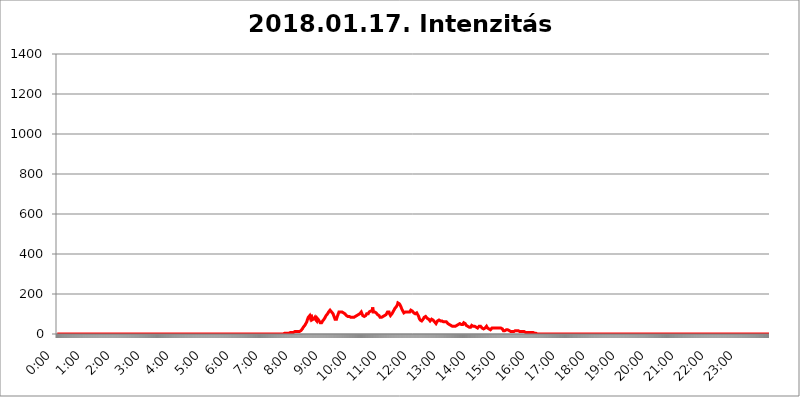
| Category | 2018.01.17. Intenzitás [W/m^2] |
|---|---|
| 0.0 | 0 |
| 0.0006944444444444445 | 0 |
| 0.001388888888888889 | 0 |
| 0.0020833333333333333 | 0 |
| 0.002777777777777778 | 0 |
| 0.003472222222222222 | 0 |
| 0.004166666666666667 | 0 |
| 0.004861111111111111 | 0 |
| 0.005555555555555556 | 0 |
| 0.0062499999999999995 | 0 |
| 0.006944444444444444 | 0 |
| 0.007638888888888889 | 0 |
| 0.008333333333333333 | 0 |
| 0.009027777777777779 | 0 |
| 0.009722222222222222 | 0 |
| 0.010416666666666666 | 0 |
| 0.011111111111111112 | 0 |
| 0.011805555555555555 | 0 |
| 0.012499999999999999 | 0 |
| 0.013194444444444444 | 0 |
| 0.013888888888888888 | 0 |
| 0.014583333333333332 | 0 |
| 0.015277777777777777 | 0 |
| 0.015972222222222224 | 0 |
| 0.016666666666666666 | 0 |
| 0.017361111111111112 | 0 |
| 0.018055555555555557 | 0 |
| 0.01875 | 0 |
| 0.019444444444444445 | 0 |
| 0.02013888888888889 | 0 |
| 0.020833333333333332 | 0 |
| 0.02152777777777778 | 0 |
| 0.022222222222222223 | 0 |
| 0.02291666666666667 | 0 |
| 0.02361111111111111 | 0 |
| 0.024305555555555556 | 0 |
| 0.024999999999999998 | 0 |
| 0.025694444444444447 | 0 |
| 0.02638888888888889 | 0 |
| 0.027083333333333334 | 0 |
| 0.027777777777777776 | 0 |
| 0.02847222222222222 | 0 |
| 0.029166666666666664 | 0 |
| 0.029861111111111113 | 0 |
| 0.030555555555555555 | 0 |
| 0.03125 | 0 |
| 0.03194444444444445 | 0 |
| 0.03263888888888889 | 0 |
| 0.03333333333333333 | 0 |
| 0.034027777777777775 | 0 |
| 0.034722222222222224 | 0 |
| 0.035416666666666666 | 0 |
| 0.036111111111111115 | 0 |
| 0.03680555555555556 | 0 |
| 0.0375 | 0 |
| 0.03819444444444444 | 0 |
| 0.03888888888888889 | 0 |
| 0.03958333333333333 | 0 |
| 0.04027777777777778 | 0 |
| 0.04097222222222222 | 0 |
| 0.041666666666666664 | 0 |
| 0.042361111111111106 | 0 |
| 0.04305555555555556 | 0 |
| 0.043750000000000004 | 0 |
| 0.044444444444444446 | 0 |
| 0.04513888888888889 | 0 |
| 0.04583333333333334 | 0 |
| 0.04652777777777778 | 0 |
| 0.04722222222222222 | 0 |
| 0.04791666666666666 | 0 |
| 0.04861111111111111 | 0 |
| 0.049305555555555554 | 0 |
| 0.049999999999999996 | 0 |
| 0.05069444444444445 | 0 |
| 0.051388888888888894 | 0 |
| 0.052083333333333336 | 0 |
| 0.05277777777777778 | 0 |
| 0.05347222222222222 | 0 |
| 0.05416666666666667 | 0 |
| 0.05486111111111111 | 0 |
| 0.05555555555555555 | 0 |
| 0.05625 | 0 |
| 0.05694444444444444 | 0 |
| 0.057638888888888885 | 0 |
| 0.05833333333333333 | 0 |
| 0.05902777777777778 | 0 |
| 0.059722222222222225 | 0 |
| 0.06041666666666667 | 0 |
| 0.061111111111111116 | 0 |
| 0.06180555555555556 | 0 |
| 0.0625 | 0 |
| 0.06319444444444444 | 0 |
| 0.06388888888888888 | 0 |
| 0.06458333333333334 | 0 |
| 0.06527777777777778 | 0 |
| 0.06597222222222222 | 0 |
| 0.06666666666666667 | 0 |
| 0.06736111111111111 | 0 |
| 0.06805555555555555 | 0 |
| 0.06874999999999999 | 0 |
| 0.06944444444444443 | 0 |
| 0.07013888888888889 | 0 |
| 0.07083333333333333 | 0 |
| 0.07152777777777779 | 0 |
| 0.07222222222222223 | 0 |
| 0.07291666666666667 | 0 |
| 0.07361111111111111 | 0 |
| 0.07430555555555556 | 0 |
| 0.075 | 0 |
| 0.07569444444444444 | 0 |
| 0.0763888888888889 | 0 |
| 0.07708333333333334 | 0 |
| 0.07777777777777778 | 0 |
| 0.07847222222222222 | 0 |
| 0.07916666666666666 | 0 |
| 0.0798611111111111 | 0 |
| 0.08055555555555556 | 0 |
| 0.08125 | 0 |
| 0.08194444444444444 | 0 |
| 0.08263888888888889 | 0 |
| 0.08333333333333333 | 0 |
| 0.08402777777777777 | 0 |
| 0.08472222222222221 | 0 |
| 0.08541666666666665 | 0 |
| 0.08611111111111112 | 0 |
| 0.08680555555555557 | 0 |
| 0.08750000000000001 | 0 |
| 0.08819444444444445 | 0 |
| 0.08888888888888889 | 0 |
| 0.08958333333333333 | 0 |
| 0.09027777777777778 | 0 |
| 0.09097222222222222 | 0 |
| 0.09166666666666667 | 0 |
| 0.09236111111111112 | 0 |
| 0.09305555555555556 | 0 |
| 0.09375 | 0 |
| 0.09444444444444444 | 0 |
| 0.09513888888888888 | 0 |
| 0.09583333333333333 | 0 |
| 0.09652777777777777 | 0 |
| 0.09722222222222222 | 0 |
| 0.09791666666666667 | 0 |
| 0.09861111111111111 | 0 |
| 0.09930555555555555 | 0 |
| 0.09999999999999999 | 0 |
| 0.10069444444444443 | 0 |
| 0.1013888888888889 | 0 |
| 0.10208333333333335 | 0 |
| 0.10277777777777779 | 0 |
| 0.10347222222222223 | 0 |
| 0.10416666666666667 | 0 |
| 0.10486111111111111 | 0 |
| 0.10555555555555556 | 0 |
| 0.10625 | 0 |
| 0.10694444444444444 | 0 |
| 0.1076388888888889 | 0 |
| 0.10833333333333334 | 0 |
| 0.10902777777777778 | 0 |
| 0.10972222222222222 | 0 |
| 0.1111111111111111 | 0 |
| 0.11180555555555556 | 0 |
| 0.11180555555555556 | 0 |
| 0.1125 | 0 |
| 0.11319444444444444 | 0 |
| 0.11388888888888889 | 0 |
| 0.11458333333333333 | 0 |
| 0.11527777777777777 | 0 |
| 0.11597222222222221 | 0 |
| 0.11666666666666665 | 0 |
| 0.1173611111111111 | 0 |
| 0.11805555555555557 | 0 |
| 0.11944444444444445 | 0 |
| 0.12013888888888889 | 0 |
| 0.12083333333333333 | 0 |
| 0.12152777777777778 | 0 |
| 0.12222222222222223 | 0 |
| 0.12291666666666667 | 0 |
| 0.12291666666666667 | 0 |
| 0.12361111111111112 | 0 |
| 0.12430555555555556 | 0 |
| 0.125 | 0 |
| 0.12569444444444444 | 0 |
| 0.12638888888888888 | 0 |
| 0.12708333333333333 | 0 |
| 0.16875 | 0 |
| 0.12847222222222224 | 0 |
| 0.12916666666666668 | 0 |
| 0.12986111111111112 | 0 |
| 0.13055555555555556 | 0 |
| 0.13125 | 0 |
| 0.13194444444444445 | 0 |
| 0.1326388888888889 | 0 |
| 0.13333333333333333 | 0 |
| 0.13402777777777777 | 0 |
| 0.13402777777777777 | 0 |
| 0.13472222222222222 | 0 |
| 0.13541666666666666 | 0 |
| 0.1361111111111111 | 0 |
| 0.13749999999999998 | 0 |
| 0.13819444444444443 | 0 |
| 0.1388888888888889 | 0 |
| 0.13958333333333334 | 0 |
| 0.14027777777777778 | 0 |
| 0.14097222222222222 | 0 |
| 0.14166666666666666 | 0 |
| 0.1423611111111111 | 0 |
| 0.14305555555555557 | 0 |
| 0.14375000000000002 | 0 |
| 0.14444444444444446 | 0 |
| 0.1451388888888889 | 0 |
| 0.1451388888888889 | 0 |
| 0.14652777777777778 | 0 |
| 0.14722222222222223 | 0 |
| 0.14791666666666667 | 0 |
| 0.1486111111111111 | 0 |
| 0.14930555555555555 | 0 |
| 0.15 | 0 |
| 0.15069444444444444 | 0 |
| 0.15138888888888888 | 0 |
| 0.15208333333333332 | 0 |
| 0.15277777777777776 | 0 |
| 0.15347222222222223 | 0 |
| 0.15416666666666667 | 0 |
| 0.15486111111111112 | 0 |
| 0.15555555555555556 | 0 |
| 0.15625 | 0 |
| 0.15694444444444444 | 0 |
| 0.15763888888888888 | 0 |
| 0.15833333333333333 | 0 |
| 0.15902777777777777 | 0 |
| 0.15972222222222224 | 0 |
| 0.16041666666666668 | 0 |
| 0.16111111111111112 | 0 |
| 0.16180555555555556 | 0 |
| 0.1625 | 0 |
| 0.16319444444444445 | 0 |
| 0.1638888888888889 | 0 |
| 0.16458333333333333 | 0 |
| 0.16527777777777777 | 0 |
| 0.16597222222222222 | 0 |
| 0.16666666666666666 | 0 |
| 0.1673611111111111 | 0 |
| 0.16805555555555554 | 0 |
| 0.16874999999999998 | 0 |
| 0.16944444444444443 | 0 |
| 0.17013888888888887 | 0 |
| 0.1708333333333333 | 0 |
| 0.17152777777777775 | 0 |
| 0.17222222222222225 | 0 |
| 0.1729166666666667 | 0 |
| 0.17361111111111113 | 0 |
| 0.17430555555555557 | 0 |
| 0.17500000000000002 | 0 |
| 0.17569444444444446 | 0 |
| 0.1763888888888889 | 0 |
| 0.17708333333333334 | 0 |
| 0.17777777777777778 | 0 |
| 0.17847222222222223 | 0 |
| 0.17916666666666667 | 0 |
| 0.1798611111111111 | 0 |
| 0.18055555555555555 | 0 |
| 0.18125 | 0 |
| 0.18194444444444444 | 0 |
| 0.1826388888888889 | 0 |
| 0.18333333333333335 | 0 |
| 0.1840277777777778 | 0 |
| 0.18472222222222223 | 0 |
| 0.18541666666666667 | 0 |
| 0.18611111111111112 | 0 |
| 0.18680555555555556 | 0 |
| 0.1875 | 0 |
| 0.18819444444444444 | 0 |
| 0.18888888888888888 | 0 |
| 0.18958333333333333 | 0 |
| 0.19027777777777777 | 0 |
| 0.1909722222222222 | 0 |
| 0.19166666666666665 | 0 |
| 0.19236111111111112 | 0 |
| 0.19305555555555554 | 0 |
| 0.19375 | 0 |
| 0.19444444444444445 | 0 |
| 0.1951388888888889 | 0 |
| 0.19583333333333333 | 0 |
| 0.19652777777777777 | 0 |
| 0.19722222222222222 | 0 |
| 0.19791666666666666 | 0 |
| 0.1986111111111111 | 0 |
| 0.19930555555555554 | 0 |
| 0.19999999999999998 | 0 |
| 0.20069444444444443 | 0 |
| 0.20138888888888887 | 0 |
| 0.2020833333333333 | 0 |
| 0.2027777777777778 | 0 |
| 0.2034722222222222 | 0 |
| 0.2041666666666667 | 0 |
| 0.20486111111111113 | 0 |
| 0.20555555555555557 | 0 |
| 0.20625000000000002 | 0 |
| 0.20694444444444446 | 0 |
| 0.2076388888888889 | 0 |
| 0.20833333333333334 | 0 |
| 0.20902777777777778 | 0 |
| 0.20972222222222223 | 0 |
| 0.21041666666666667 | 0 |
| 0.2111111111111111 | 0 |
| 0.21180555555555555 | 0 |
| 0.2125 | 0 |
| 0.21319444444444444 | 0 |
| 0.2138888888888889 | 0 |
| 0.21458333333333335 | 0 |
| 0.2152777777777778 | 0 |
| 0.21597222222222223 | 0 |
| 0.21666666666666667 | 0 |
| 0.21736111111111112 | 0 |
| 0.21805555555555556 | 0 |
| 0.21875 | 0 |
| 0.21944444444444444 | 0 |
| 0.22013888888888888 | 0 |
| 0.22083333333333333 | 0 |
| 0.22152777777777777 | 0 |
| 0.2222222222222222 | 0 |
| 0.22291666666666665 | 0 |
| 0.2236111111111111 | 0 |
| 0.22430555555555556 | 0 |
| 0.225 | 0 |
| 0.22569444444444445 | 0 |
| 0.2263888888888889 | 0 |
| 0.22708333333333333 | 0 |
| 0.22777777777777777 | 0 |
| 0.22847222222222222 | 0 |
| 0.22916666666666666 | 0 |
| 0.2298611111111111 | 0 |
| 0.23055555555555554 | 0 |
| 0.23124999999999998 | 0 |
| 0.23194444444444443 | 0 |
| 0.23263888888888887 | 0 |
| 0.2333333333333333 | 0 |
| 0.2340277777777778 | 0 |
| 0.2347222222222222 | 0 |
| 0.2354166666666667 | 0 |
| 0.23611111111111113 | 0 |
| 0.23680555555555557 | 0 |
| 0.23750000000000002 | 0 |
| 0.23819444444444446 | 0 |
| 0.2388888888888889 | 0 |
| 0.23958333333333334 | 0 |
| 0.24027777777777778 | 0 |
| 0.24097222222222223 | 0 |
| 0.24166666666666667 | 0 |
| 0.2423611111111111 | 0 |
| 0.24305555555555555 | 0 |
| 0.24375 | 0 |
| 0.24444444444444446 | 0 |
| 0.24513888888888888 | 0 |
| 0.24583333333333335 | 0 |
| 0.2465277777777778 | 0 |
| 0.24722222222222223 | 0 |
| 0.24791666666666667 | 0 |
| 0.24861111111111112 | 0 |
| 0.24930555555555556 | 0 |
| 0.25 | 0 |
| 0.25069444444444444 | 0 |
| 0.2513888888888889 | 0 |
| 0.2520833333333333 | 0 |
| 0.25277777777777777 | 0 |
| 0.2534722222222222 | 0 |
| 0.25416666666666665 | 0 |
| 0.2548611111111111 | 0 |
| 0.2555555555555556 | 0 |
| 0.25625000000000003 | 0 |
| 0.2569444444444445 | 0 |
| 0.2576388888888889 | 0 |
| 0.25833333333333336 | 0 |
| 0.2590277777777778 | 0 |
| 0.25972222222222224 | 0 |
| 0.2604166666666667 | 0 |
| 0.2611111111111111 | 0 |
| 0.26180555555555557 | 0 |
| 0.2625 | 0 |
| 0.26319444444444445 | 0 |
| 0.2638888888888889 | 0 |
| 0.26458333333333334 | 0 |
| 0.2652777777777778 | 0 |
| 0.2659722222222222 | 0 |
| 0.26666666666666666 | 0 |
| 0.2673611111111111 | 0 |
| 0.26805555555555555 | 0 |
| 0.26875 | 0 |
| 0.26944444444444443 | 0 |
| 0.2701388888888889 | 0 |
| 0.2708333333333333 | 0 |
| 0.27152777777777776 | 0 |
| 0.2722222222222222 | 0 |
| 0.27291666666666664 | 0 |
| 0.2736111111111111 | 0 |
| 0.2743055555555555 | 0 |
| 0.27499999999999997 | 0 |
| 0.27569444444444446 | 0 |
| 0.27638888888888885 | 0 |
| 0.27708333333333335 | 0 |
| 0.2777777777777778 | 0 |
| 0.27847222222222223 | 0 |
| 0.2791666666666667 | 0 |
| 0.2798611111111111 | 0 |
| 0.28055555555555556 | 0 |
| 0.28125 | 0 |
| 0.28194444444444444 | 0 |
| 0.2826388888888889 | 0 |
| 0.2833333333333333 | 0 |
| 0.28402777777777777 | 0 |
| 0.2847222222222222 | 0 |
| 0.28541666666666665 | 0 |
| 0.28611111111111115 | 0 |
| 0.28680555555555554 | 0 |
| 0.28750000000000003 | 0 |
| 0.2881944444444445 | 0 |
| 0.2888888888888889 | 0 |
| 0.28958333333333336 | 0 |
| 0.2902777777777778 | 0 |
| 0.29097222222222224 | 0 |
| 0.2916666666666667 | 0 |
| 0.2923611111111111 | 0 |
| 0.29305555555555557 | 0 |
| 0.29375 | 0 |
| 0.29444444444444445 | 0 |
| 0.2951388888888889 | 0 |
| 0.29583333333333334 | 0 |
| 0.2965277777777778 | 0 |
| 0.2972222222222222 | 0 |
| 0.29791666666666666 | 0 |
| 0.2986111111111111 | 0 |
| 0.29930555555555555 | 0 |
| 0.3 | 0 |
| 0.30069444444444443 | 0 |
| 0.3013888888888889 | 0 |
| 0.3020833333333333 | 0 |
| 0.30277777777777776 | 0 |
| 0.3034722222222222 | 0 |
| 0.30416666666666664 | 0 |
| 0.3048611111111111 | 0 |
| 0.3055555555555555 | 0 |
| 0.30624999999999997 | 0 |
| 0.3069444444444444 | 0 |
| 0.3076388888888889 | 0 |
| 0.30833333333333335 | 0 |
| 0.3090277777777778 | 0 |
| 0.30972222222222223 | 0 |
| 0.3104166666666667 | 0 |
| 0.3111111111111111 | 0 |
| 0.31180555555555556 | 0 |
| 0.3125 | 0 |
| 0.31319444444444444 | 0 |
| 0.3138888888888889 | 0 |
| 0.3145833333333333 | 0 |
| 0.31527777777777777 | 0 |
| 0.3159722222222222 | 0 |
| 0.31666666666666665 | 0 |
| 0.31736111111111115 | 3.525 |
| 0.31805555555555554 | 3.525 |
| 0.31875000000000003 | 3.525 |
| 0.3194444444444445 | 3.525 |
| 0.3201388888888889 | 3.525 |
| 0.32083333333333336 | 3.525 |
| 0.3215277777777778 | 3.525 |
| 0.32222222222222224 | 3.525 |
| 0.3229166666666667 | 3.525 |
| 0.3236111111111111 | 3.525 |
| 0.32430555555555557 | 3.525 |
| 0.325 | 3.525 |
| 0.32569444444444445 | 3.525 |
| 0.3263888888888889 | 7.887 |
| 0.32708333333333334 | 7.887 |
| 0.3277777777777778 | 7.887 |
| 0.3284722222222222 | 7.887 |
| 0.32916666666666666 | 7.887 |
| 0.3298611111111111 | 7.887 |
| 0.33055555555555555 | 7.887 |
| 0.33125 | 7.887 |
| 0.33194444444444443 | 7.887 |
| 0.3326388888888889 | 7.887 |
| 0.3333333333333333 | 12.257 |
| 0.3340277777777778 | 12.257 |
| 0.3347222222222222 | 12.257 |
| 0.3354166666666667 | 12.257 |
| 0.3361111111111111 | 12.257 |
| 0.3368055555555556 | 12.257 |
| 0.33749999999999997 | 12.257 |
| 0.33819444444444446 | 12.257 |
| 0.33888888888888885 | 12.257 |
| 0.33958333333333335 | 12.257 |
| 0.34027777777777773 | 12.257 |
| 0.34097222222222223 | 12.257 |
| 0.3416666666666666 | 16.636 |
| 0.3423611111111111 | 21.024 |
| 0.3430555555555555 | 21.024 |
| 0.34375 | 25.419 |
| 0.3444444444444445 | 29.823 |
| 0.3451388888888889 | 34.234 |
| 0.3458333333333334 | 38.653 |
| 0.34652777777777777 | 38.653 |
| 0.34722222222222227 | 43.079 |
| 0.34791666666666665 | 47.511 |
| 0.34861111111111115 | 51.951 |
| 0.34930555555555554 | 56.398 |
| 0.35000000000000003 | 60.85 |
| 0.3506944444444444 | 69.775 |
| 0.3513888888888889 | 74.246 |
| 0.3520833333333333 | 83.205 |
| 0.3527777777777778 | 83.205 |
| 0.3534722222222222 | 83.205 |
| 0.3541666666666667 | 92.184 |
| 0.3548611111111111 | 83.205 |
| 0.35555555555555557 | 83.205 |
| 0.35625 | 96.682 |
| 0.35694444444444445 | 69.775 |
| 0.3576388888888889 | 74.246 |
| 0.35833333333333334 | 69.775 |
| 0.3590277777777778 | 74.246 |
| 0.3597222222222222 | 78.722 |
| 0.36041666666666666 | 78.722 |
| 0.3611111111111111 | 83.205 |
| 0.36180555555555555 | 74.246 |
| 0.3625 | 74.246 |
| 0.36319444444444443 | 69.775 |
| 0.3638888888888889 | 65.31 |
| 0.3645833333333333 | 78.722 |
| 0.3652777777777778 | 78.722 |
| 0.3659722222222222 | 78.722 |
| 0.3666666666666667 | 69.775 |
| 0.3673611111111111 | 65.31 |
| 0.3680555555555556 | 65.31 |
| 0.36874999999999997 | 56.398 |
| 0.36944444444444446 | 56.398 |
| 0.37013888888888885 | 56.398 |
| 0.37083333333333335 | 56.398 |
| 0.37152777777777773 | 60.85 |
| 0.37222222222222223 | 65.31 |
| 0.3729166666666666 | 65.31 |
| 0.3736111111111111 | 69.775 |
| 0.3743055555555555 | 74.246 |
| 0.375 | 78.722 |
| 0.3756944444444445 | 83.205 |
| 0.3763888888888889 | 87.692 |
| 0.3770833333333334 | 92.184 |
| 0.37777777777777777 | 92.184 |
| 0.37847222222222227 | 96.682 |
| 0.37916666666666665 | 101.184 |
| 0.37986111111111115 | 105.69 |
| 0.38055555555555554 | 110.201 |
| 0.38125000000000003 | 110.201 |
| 0.3819444444444444 | 114.716 |
| 0.3826388888888889 | 119.235 |
| 0.3833333333333333 | 119.235 |
| 0.3840277777777778 | 114.716 |
| 0.3847222222222222 | 110.201 |
| 0.3854166666666667 | 105.69 |
| 0.3861111111111111 | 110.201 |
| 0.38680555555555557 | 101.184 |
| 0.3875 | 96.682 |
| 0.38819444444444445 | 87.692 |
| 0.3888888888888889 | 87.692 |
| 0.38958333333333334 | 74.246 |
| 0.3902777777777778 | 74.246 |
| 0.3909722222222222 | 74.246 |
| 0.39166666666666666 | 74.246 |
| 0.3923611111111111 | 83.205 |
| 0.39305555555555555 | 87.692 |
| 0.39375 | 96.682 |
| 0.39444444444444443 | 101.184 |
| 0.3951388888888889 | 110.201 |
| 0.3958333333333333 | 110.201 |
| 0.3965277777777778 | 110.201 |
| 0.3972222222222222 | 110.201 |
| 0.3979166666666667 | 110.201 |
| 0.3986111111111111 | 114.716 |
| 0.3993055555555556 | 110.201 |
| 0.39999999999999997 | 110.201 |
| 0.40069444444444446 | 105.69 |
| 0.40138888888888885 | 105.69 |
| 0.40208333333333335 | 101.184 |
| 0.40277777777777773 | 101.184 |
| 0.40347222222222223 | 101.184 |
| 0.4041666666666666 | 96.682 |
| 0.4048611111111111 | 96.682 |
| 0.4055555555555555 | 92.184 |
| 0.40625 | 92.184 |
| 0.4069444444444445 | 87.692 |
| 0.4076388888888889 | 87.692 |
| 0.4083333333333334 | 87.692 |
| 0.40902777777777777 | 87.692 |
| 0.40972222222222227 | 87.692 |
| 0.41041666666666665 | 87.692 |
| 0.41111111111111115 | 87.692 |
| 0.41180555555555554 | 83.205 |
| 0.41250000000000003 | 87.692 |
| 0.4131944444444444 | 83.205 |
| 0.4138888888888889 | 83.205 |
| 0.4145833333333333 | 83.205 |
| 0.4152777777777778 | 83.205 |
| 0.4159722222222222 | 83.205 |
| 0.4166666666666667 | 87.692 |
| 0.4173611111111111 | 87.692 |
| 0.41805555555555557 | 87.692 |
| 0.41875 | 92.184 |
| 0.41944444444444445 | 92.184 |
| 0.4201388888888889 | 92.184 |
| 0.42083333333333334 | 92.184 |
| 0.4215277777777778 | 92.184 |
| 0.4222222222222222 | 96.682 |
| 0.42291666666666666 | 96.682 |
| 0.4236111111111111 | 101.184 |
| 0.42430555555555555 | 101.184 |
| 0.425 | 105.69 |
| 0.42569444444444443 | 105.69 |
| 0.4263888888888889 | 110.201 |
| 0.4270833333333333 | 110.201 |
| 0.4277777777777778 | 110.201 |
| 0.4284722222222222 | 92.184 |
| 0.4291666666666667 | 87.692 |
| 0.4298611111111111 | 87.692 |
| 0.4305555555555556 | 87.692 |
| 0.43124999999999997 | 87.692 |
| 0.43194444444444446 | 92.184 |
| 0.43263888888888885 | 92.184 |
| 0.43333333333333335 | 96.682 |
| 0.43402777777777773 | 101.184 |
| 0.43472222222222223 | 101.184 |
| 0.4354166666666666 | 101.184 |
| 0.4361111111111111 | 101.184 |
| 0.4368055555555555 | 105.69 |
| 0.4375 | 110.201 |
| 0.4381944444444445 | 110.201 |
| 0.4388888888888889 | 114.716 |
| 0.4395833333333334 | 114.716 |
| 0.44027777777777777 | 114.716 |
| 0.44097222222222227 | 114.716 |
| 0.44166666666666665 | 114.716 |
| 0.44236111111111115 | 132.814 |
| 0.44305555555555554 | 110.201 |
| 0.44375000000000003 | 110.201 |
| 0.4444444444444444 | 110.201 |
| 0.4451388888888889 | 110.201 |
| 0.4458333333333333 | 110.201 |
| 0.4465277777777778 | 110.201 |
| 0.4472222222222222 | 105.69 |
| 0.4479166666666667 | 101.184 |
| 0.4486111111111111 | 101.184 |
| 0.44930555555555557 | 96.682 |
| 0.45 | 92.184 |
| 0.45069444444444445 | 92.184 |
| 0.4513888888888889 | 92.184 |
| 0.45208333333333334 | 87.692 |
| 0.4527777777777778 | 83.205 |
| 0.4534722222222222 | 83.205 |
| 0.45416666666666666 | 83.205 |
| 0.4548611111111111 | 83.205 |
| 0.45555555555555555 | 83.205 |
| 0.45625 | 83.205 |
| 0.45694444444444443 | 87.692 |
| 0.4576388888888889 | 92.184 |
| 0.4583333333333333 | 92.184 |
| 0.4590277777777778 | 92.184 |
| 0.4597222222222222 | 92.184 |
| 0.4604166666666667 | 96.682 |
| 0.4611111111111111 | 96.682 |
| 0.4618055555555556 | 101.184 |
| 0.46249999999999997 | 101.184 |
| 0.46319444444444446 | 110.201 |
| 0.46388888888888885 | 110.201 |
| 0.46458333333333335 | 110.201 |
| 0.46527777777777773 | 110.201 |
| 0.46597222222222223 | 101.184 |
| 0.4666666666666666 | 96.682 |
| 0.4673611111111111 | 92.184 |
| 0.4680555555555555 | 96.682 |
| 0.46875 | 96.682 |
| 0.4694444444444445 | 101.184 |
| 0.4701388888888889 | 105.69 |
| 0.4708333333333334 | 110.201 |
| 0.47152777777777777 | 114.716 |
| 0.47222222222222227 | 119.235 |
| 0.47291666666666665 | 123.758 |
| 0.47361111111111115 | 128.284 |
| 0.47430555555555554 | 128.284 |
| 0.47500000000000003 | 132.814 |
| 0.4756944444444444 | 137.347 |
| 0.4763888888888889 | 141.884 |
| 0.4770833333333333 | 146.423 |
| 0.4777777777777778 | 155.509 |
| 0.4784722222222222 | 155.509 |
| 0.4791666666666667 | 155.509 |
| 0.4798611111111111 | 150.964 |
| 0.48055555555555557 | 155.509 |
| 0.48125 | 146.423 |
| 0.48194444444444445 | 137.347 |
| 0.4826388888888889 | 132.814 |
| 0.48333333333333334 | 123.758 |
| 0.4840277777777778 | 119.235 |
| 0.4847222222222222 | 114.716 |
| 0.48541666666666666 | 110.201 |
| 0.4861111111111111 | 105.69 |
| 0.48680555555555555 | 105.69 |
| 0.4875 | 105.69 |
| 0.48819444444444443 | 110.201 |
| 0.4888888888888889 | 110.201 |
| 0.4895833333333333 | 110.201 |
| 0.4902777777777778 | 110.201 |
| 0.4909722222222222 | 110.201 |
| 0.4916666666666667 | 110.201 |
| 0.4923611111111111 | 110.201 |
| 0.4930555555555556 | 105.69 |
| 0.49374999999999997 | 110.201 |
| 0.49444444444444446 | 110.201 |
| 0.49513888888888885 | 114.716 |
| 0.49583333333333335 | 119.235 |
| 0.49652777777777773 | 119.235 |
| 0.49722222222222223 | 114.716 |
| 0.4979166666666666 | 114.716 |
| 0.4986111111111111 | 110.201 |
| 0.4993055555555555 | 110.201 |
| 0.5 | 105.69 |
| 0.5006944444444444 | 101.184 |
| 0.5013888888888889 | 101.184 |
| 0.5020833333333333 | 101.184 |
| 0.5027777777777778 | 105.69 |
| 0.5034722222222222 | 105.69 |
| 0.5041666666666667 | 105.69 |
| 0.5048611111111111 | 101.184 |
| 0.5055555555555555 | 96.682 |
| 0.50625 | 92.184 |
| 0.5069444444444444 | 87.692 |
| 0.5076388888888889 | 78.722 |
| 0.5083333333333333 | 74.246 |
| 0.5090277777777777 | 69.775 |
| 0.5097222222222222 | 65.31 |
| 0.5104166666666666 | 65.31 |
| 0.5111111111111112 | 65.31 |
| 0.5118055555555555 | 65.31 |
| 0.5125000000000001 | 69.775 |
| 0.5131944444444444 | 74.246 |
| 0.513888888888889 | 78.722 |
| 0.5145833333333333 | 83.205 |
| 0.5152777777777778 | 87.692 |
| 0.5159722222222222 | 87.692 |
| 0.5166666666666667 | 87.692 |
| 0.517361111111111 | 87.692 |
| 0.5180555555555556 | 83.205 |
| 0.5187499999999999 | 78.722 |
| 0.5194444444444445 | 74.246 |
| 0.5201388888888888 | 74.246 |
| 0.5208333333333334 | 74.246 |
| 0.5215277777777778 | 69.775 |
| 0.5222222222222223 | 69.775 |
| 0.5229166666666667 | 65.31 |
| 0.5236111111111111 | 69.775 |
| 0.5243055555555556 | 69.775 |
| 0.525 | 74.246 |
| 0.5256944444444445 | 74.246 |
| 0.5263888888888889 | 74.246 |
| 0.5270833333333333 | 69.775 |
| 0.5277777777777778 | 69.775 |
| 0.5284722222222222 | 65.31 |
| 0.5291666666666667 | 60.85 |
| 0.5298611111111111 | 56.398 |
| 0.5305555555555556 | 56.398 |
| 0.53125 | 51.951 |
| 0.5319444444444444 | 56.398 |
| 0.5326388888888889 | 56.398 |
| 0.5333333333333333 | 65.31 |
| 0.5340277777777778 | 65.31 |
| 0.5347222222222222 | 65.31 |
| 0.5354166666666667 | 69.775 |
| 0.5361111111111111 | 69.775 |
| 0.5368055555555555 | 65.31 |
| 0.5375 | 65.31 |
| 0.5381944444444444 | 65.31 |
| 0.5388888888888889 | 65.31 |
| 0.5395833333333333 | 65.31 |
| 0.5402777777777777 | 65.31 |
| 0.5409722222222222 | 60.85 |
| 0.5416666666666666 | 60.85 |
| 0.5423611111111112 | 60.85 |
| 0.5430555555555555 | 56.398 |
| 0.5437500000000001 | 60.85 |
| 0.5444444444444444 | 60.85 |
| 0.545138888888889 | 60.85 |
| 0.5458333333333333 | 60.85 |
| 0.5465277777777778 | 56.398 |
| 0.5472222222222222 | 56.398 |
| 0.5479166666666667 | 51.951 |
| 0.548611111111111 | 51.951 |
| 0.5493055555555556 | 47.511 |
| 0.5499999999999999 | 47.511 |
| 0.5506944444444445 | 43.079 |
| 0.5513888888888888 | 43.079 |
| 0.5520833333333334 | 43.079 |
| 0.5527777777777778 | 43.079 |
| 0.5534722222222223 | 38.653 |
| 0.5541666666666667 | 38.653 |
| 0.5548611111111111 | 38.653 |
| 0.5555555555555556 | 38.653 |
| 0.55625 | 38.653 |
| 0.5569444444444445 | 38.653 |
| 0.5576388888888889 | 38.653 |
| 0.5583333333333333 | 38.653 |
| 0.5590277777777778 | 38.653 |
| 0.5597222222222222 | 43.079 |
| 0.5604166666666667 | 43.079 |
| 0.5611111111111111 | 43.079 |
| 0.5618055555555556 | 43.079 |
| 0.5625 | 47.511 |
| 0.5631944444444444 | 47.511 |
| 0.5638888888888889 | 47.511 |
| 0.5645833333333333 | 51.951 |
| 0.5652777777777778 | 51.951 |
| 0.5659722222222222 | 51.951 |
| 0.5666666666666667 | 47.511 |
| 0.5673611111111111 | 47.511 |
| 0.5680555555555555 | 47.511 |
| 0.56875 | 47.511 |
| 0.5694444444444444 | 51.951 |
| 0.5701388888888889 | 56.398 |
| 0.5708333333333333 | 60.85 |
| 0.5715277777777777 | 56.398 |
| 0.5722222222222222 | 51.951 |
| 0.5729166666666666 | 47.511 |
| 0.5736111111111112 | 43.079 |
| 0.5743055555555555 | 43.079 |
| 0.5750000000000001 | 38.653 |
| 0.5756944444444444 | 38.653 |
| 0.576388888888889 | 38.653 |
| 0.5770833333333333 | 34.234 |
| 0.5777777777777778 | 34.234 |
| 0.5784722222222222 | 34.234 |
| 0.5791666666666667 | 34.234 |
| 0.579861111111111 | 34.234 |
| 0.5805555555555556 | 38.653 |
| 0.5812499999999999 | 43.079 |
| 0.5819444444444445 | 43.079 |
| 0.5826388888888888 | 43.079 |
| 0.5833333333333334 | 38.653 |
| 0.5840277777777778 | 38.653 |
| 0.5847222222222223 | 38.653 |
| 0.5854166666666667 | 38.653 |
| 0.5861111111111111 | 38.653 |
| 0.5868055555555556 | 38.653 |
| 0.5875 | 34.234 |
| 0.5881944444444445 | 34.234 |
| 0.5888888888888889 | 29.823 |
| 0.5895833333333333 | 29.823 |
| 0.5902777777777778 | 29.823 |
| 0.5909722222222222 | 34.234 |
| 0.5916666666666667 | 38.653 |
| 0.5923611111111111 | 38.653 |
| 0.5930555555555556 | 38.653 |
| 0.59375 | 38.653 |
| 0.5944444444444444 | 38.653 |
| 0.5951388888888889 | 34.234 |
| 0.5958333333333333 | 29.823 |
| 0.5965277777777778 | 29.823 |
| 0.5972222222222222 | 25.419 |
| 0.5979166666666667 | 25.419 |
| 0.5986111111111111 | 25.419 |
| 0.5993055555555555 | 29.823 |
| 0.6 | 29.823 |
| 0.6006944444444444 | 34.234 |
| 0.6013888888888889 | 34.234 |
| 0.6020833333333333 | 38.653 |
| 0.6027777777777777 | 34.234 |
| 0.6034722222222222 | 29.823 |
| 0.6041666666666666 | 29.823 |
| 0.6048611111111112 | 29.823 |
| 0.6055555555555555 | 25.419 |
| 0.6062500000000001 | 21.024 |
| 0.6069444444444444 | 21.024 |
| 0.607638888888889 | 21.024 |
| 0.6083333333333333 | 21.024 |
| 0.6090277777777778 | 21.024 |
| 0.6097222222222222 | 29.823 |
| 0.6104166666666667 | 29.823 |
| 0.611111111111111 | 34.234 |
| 0.6118055555555556 | 29.823 |
| 0.6124999999999999 | 29.823 |
| 0.6131944444444445 | 29.823 |
| 0.6138888888888888 | 29.823 |
| 0.6145833333333334 | 29.823 |
| 0.6152777777777778 | 29.823 |
| 0.6159722222222223 | 29.823 |
| 0.6166666666666667 | 25.419 |
| 0.6173611111111111 | 25.419 |
| 0.6180555555555556 | 29.823 |
| 0.61875 | 29.823 |
| 0.6194444444444445 | 29.823 |
| 0.6201388888888889 | 29.823 |
| 0.6208333333333333 | 34.234 |
| 0.6215277777777778 | 34.234 |
| 0.6222222222222222 | 29.823 |
| 0.6229166666666667 | 29.823 |
| 0.6236111111111111 | 25.419 |
| 0.6243055555555556 | 25.419 |
| 0.625 | 21.024 |
| 0.6256944444444444 | 16.636 |
| 0.6263888888888889 | 12.257 |
| 0.6270833333333333 | 16.636 |
| 0.6277777777777778 | 16.636 |
| 0.6284722222222222 | 16.636 |
| 0.6291666666666667 | 21.024 |
| 0.6298611111111111 | 21.024 |
| 0.6305555555555555 | 21.024 |
| 0.63125 | 21.024 |
| 0.6319444444444444 | 21.024 |
| 0.6326388888888889 | 21.024 |
| 0.6333333333333333 | 16.636 |
| 0.6340277777777777 | 16.636 |
| 0.6347222222222222 | 12.257 |
| 0.6354166666666666 | 12.257 |
| 0.6361111111111112 | 12.257 |
| 0.6368055555555555 | 12.257 |
| 0.6375000000000001 | 12.257 |
| 0.6381944444444444 | 12.257 |
| 0.638888888888889 | 12.257 |
| 0.6395833333333333 | 12.257 |
| 0.6402777777777778 | 12.257 |
| 0.6409722222222222 | 12.257 |
| 0.6416666666666667 | 12.257 |
| 0.642361111111111 | 16.636 |
| 0.6430555555555556 | 16.636 |
| 0.6437499999999999 | 16.636 |
| 0.6444444444444445 | 16.636 |
| 0.6451388888888888 | 16.636 |
| 0.6458333333333334 | 16.636 |
| 0.6465277777777778 | 16.636 |
| 0.6472222222222223 | 12.257 |
| 0.6479166666666667 | 12.257 |
| 0.6486111111111111 | 12.257 |
| 0.6493055555555556 | 12.257 |
| 0.65 | 12.257 |
| 0.6506944444444445 | 12.257 |
| 0.6513888888888889 | 12.257 |
| 0.6520833333333333 | 12.257 |
| 0.6527777777777778 | 12.257 |
| 0.6534722222222222 | 12.257 |
| 0.6541666666666667 | 12.257 |
| 0.6548611111111111 | 12.257 |
| 0.6555555555555556 | 12.257 |
| 0.65625 | 12.257 |
| 0.6569444444444444 | 7.887 |
| 0.6576388888888889 | 7.887 |
| 0.6583333333333333 | 7.887 |
| 0.6590277777777778 | 7.887 |
| 0.6597222222222222 | 7.887 |
| 0.6604166666666667 | 7.887 |
| 0.6611111111111111 | 7.887 |
| 0.6618055555555555 | 7.887 |
| 0.6625 | 7.887 |
| 0.6631944444444444 | 7.887 |
| 0.6638888888888889 | 7.887 |
| 0.6645833333333333 | 7.887 |
| 0.6652777777777777 | 7.887 |
| 0.6659722222222222 | 7.887 |
| 0.6666666666666666 | 7.887 |
| 0.6673611111111111 | 7.887 |
| 0.6680555555555556 | 3.525 |
| 0.6687500000000001 | 3.525 |
| 0.6694444444444444 | 3.525 |
| 0.6701388888888888 | 3.525 |
| 0.6708333333333334 | 3.525 |
| 0.6715277777777778 | 3.525 |
| 0.6722222222222222 | 3.525 |
| 0.6729166666666666 | 3.525 |
| 0.6736111111111112 | 0 |
| 0.6743055555555556 | 0 |
| 0.6749999999999999 | 0 |
| 0.6756944444444444 | 0 |
| 0.6763888888888889 | 0 |
| 0.6770833333333334 | 0 |
| 0.6777777777777777 | 0 |
| 0.6784722222222223 | 0 |
| 0.6791666666666667 | 0 |
| 0.6798611111111111 | 0 |
| 0.6805555555555555 | 0 |
| 0.68125 | 0 |
| 0.6819444444444445 | 0 |
| 0.6826388888888889 | 0 |
| 0.6833333333333332 | 0 |
| 0.6840277777777778 | 0 |
| 0.6847222222222222 | 0 |
| 0.6854166666666667 | 0 |
| 0.686111111111111 | 0 |
| 0.6868055555555556 | 0 |
| 0.6875 | 0 |
| 0.6881944444444444 | 0 |
| 0.688888888888889 | 0 |
| 0.6895833333333333 | 0 |
| 0.6902777777777778 | 0 |
| 0.6909722222222222 | 0 |
| 0.6916666666666668 | 0 |
| 0.6923611111111111 | 0 |
| 0.6930555555555555 | 0 |
| 0.69375 | 0 |
| 0.6944444444444445 | 0 |
| 0.6951388888888889 | 0 |
| 0.6958333333333333 | 0 |
| 0.6965277777777777 | 0 |
| 0.6972222222222223 | 0 |
| 0.6979166666666666 | 0 |
| 0.6986111111111111 | 0 |
| 0.6993055555555556 | 0 |
| 0.7000000000000001 | 0 |
| 0.7006944444444444 | 0 |
| 0.7013888888888888 | 0 |
| 0.7020833333333334 | 0 |
| 0.7027777777777778 | 0 |
| 0.7034722222222222 | 0 |
| 0.7041666666666666 | 0 |
| 0.7048611111111112 | 0 |
| 0.7055555555555556 | 0 |
| 0.7062499999999999 | 0 |
| 0.7069444444444444 | 0 |
| 0.7076388888888889 | 0 |
| 0.7083333333333334 | 0 |
| 0.7090277777777777 | 0 |
| 0.7097222222222223 | 0 |
| 0.7104166666666667 | 0 |
| 0.7111111111111111 | 0 |
| 0.7118055555555555 | 0 |
| 0.7125 | 0 |
| 0.7131944444444445 | 0 |
| 0.7138888888888889 | 0 |
| 0.7145833333333332 | 0 |
| 0.7152777777777778 | 0 |
| 0.7159722222222222 | 0 |
| 0.7166666666666667 | 0 |
| 0.717361111111111 | 0 |
| 0.7180555555555556 | 0 |
| 0.71875 | 0 |
| 0.7194444444444444 | 0 |
| 0.720138888888889 | 0 |
| 0.7208333333333333 | 0 |
| 0.7215277777777778 | 0 |
| 0.7222222222222222 | 0 |
| 0.7229166666666668 | 0 |
| 0.7236111111111111 | 0 |
| 0.7243055555555555 | 0 |
| 0.725 | 0 |
| 0.7256944444444445 | 0 |
| 0.7263888888888889 | 0 |
| 0.7270833333333333 | 0 |
| 0.7277777777777777 | 0 |
| 0.7284722222222223 | 0 |
| 0.7291666666666666 | 0 |
| 0.7298611111111111 | 0 |
| 0.7305555555555556 | 0 |
| 0.7312500000000001 | 0 |
| 0.7319444444444444 | 0 |
| 0.7326388888888888 | 0 |
| 0.7333333333333334 | 0 |
| 0.7340277777777778 | 0 |
| 0.7347222222222222 | 0 |
| 0.7354166666666666 | 0 |
| 0.7361111111111112 | 0 |
| 0.7368055555555556 | 0 |
| 0.7374999999999999 | 0 |
| 0.7381944444444444 | 0 |
| 0.7388888888888889 | 0 |
| 0.7395833333333334 | 0 |
| 0.7402777777777777 | 0 |
| 0.7409722222222223 | 0 |
| 0.7416666666666667 | 0 |
| 0.7423611111111111 | 0 |
| 0.7430555555555555 | 0 |
| 0.74375 | 0 |
| 0.7444444444444445 | 0 |
| 0.7451388888888889 | 0 |
| 0.7458333333333332 | 0 |
| 0.7465277777777778 | 0 |
| 0.7472222222222222 | 0 |
| 0.7479166666666667 | 0 |
| 0.748611111111111 | 0 |
| 0.7493055555555556 | 0 |
| 0.75 | 0 |
| 0.7506944444444444 | 0 |
| 0.751388888888889 | 0 |
| 0.7520833333333333 | 0 |
| 0.7527777777777778 | 0 |
| 0.7534722222222222 | 0 |
| 0.7541666666666668 | 0 |
| 0.7548611111111111 | 0 |
| 0.7555555555555555 | 0 |
| 0.75625 | 0 |
| 0.7569444444444445 | 0 |
| 0.7576388888888889 | 0 |
| 0.7583333333333333 | 0 |
| 0.7590277777777777 | 0 |
| 0.7597222222222223 | 0 |
| 0.7604166666666666 | 0 |
| 0.7611111111111111 | 0 |
| 0.7618055555555556 | 0 |
| 0.7625000000000001 | 0 |
| 0.7631944444444444 | 0 |
| 0.7638888888888888 | 0 |
| 0.7645833333333334 | 0 |
| 0.7652777777777778 | 0 |
| 0.7659722222222222 | 0 |
| 0.7666666666666666 | 0 |
| 0.7673611111111112 | 0 |
| 0.7680555555555556 | 0 |
| 0.7687499999999999 | 0 |
| 0.7694444444444444 | 0 |
| 0.7701388888888889 | 0 |
| 0.7708333333333334 | 0 |
| 0.7715277777777777 | 0 |
| 0.7722222222222223 | 0 |
| 0.7729166666666667 | 0 |
| 0.7736111111111111 | 0 |
| 0.7743055555555555 | 0 |
| 0.775 | 0 |
| 0.7756944444444445 | 0 |
| 0.7763888888888889 | 0 |
| 0.7770833333333332 | 0 |
| 0.7777777777777778 | 0 |
| 0.7784722222222222 | 0 |
| 0.7791666666666667 | 0 |
| 0.779861111111111 | 0 |
| 0.7805555555555556 | 0 |
| 0.78125 | 0 |
| 0.7819444444444444 | 0 |
| 0.782638888888889 | 0 |
| 0.7833333333333333 | 0 |
| 0.7840277777777778 | 0 |
| 0.7847222222222222 | 0 |
| 0.7854166666666668 | 0 |
| 0.7861111111111111 | 0 |
| 0.7868055555555555 | 0 |
| 0.7875 | 0 |
| 0.7881944444444445 | 0 |
| 0.7888888888888889 | 0 |
| 0.7895833333333333 | 0 |
| 0.7902777777777777 | 0 |
| 0.7909722222222223 | 0 |
| 0.7916666666666666 | 0 |
| 0.7923611111111111 | 0 |
| 0.7930555555555556 | 0 |
| 0.7937500000000001 | 0 |
| 0.7944444444444444 | 0 |
| 0.7951388888888888 | 0 |
| 0.7958333333333334 | 0 |
| 0.7965277777777778 | 0 |
| 0.7972222222222222 | 0 |
| 0.7979166666666666 | 0 |
| 0.7986111111111112 | 0 |
| 0.7993055555555556 | 0 |
| 0.7999999999999999 | 0 |
| 0.8006944444444444 | 0 |
| 0.8013888888888889 | 0 |
| 0.8020833333333334 | 0 |
| 0.8027777777777777 | 0 |
| 0.8034722222222223 | 0 |
| 0.8041666666666667 | 0 |
| 0.8048611111111111 | 0 |
| 0.8055555555555555 | 0 |
| 0.80625 | 0 |
| 0.8069444444444445 | 0 |
| 0.8076388888888889 | 0 |
| 0.8083333333333332 | 0 |
| 0.8090277777777778 | 0 |
| 0.8097222222222222 | 0 |
| 0.8104166666666667 | 0 |
| 0.811111111111111 | 0 |
| 0.8118055555555556 | 0 |
| 0.8125 | 0 |
| 0.8131944444444444 | 0 |
| 0.813888888888889 | 0 |
| 0.8145833333333333 | 0 |
| 0.8152777777777778 | 0 |
| 0.8159722222222222 | 0 |
| 0.8166666666666668 | 0 |
| 0.8173611111111111 | 0 |
| 0.8180555555555555 | 0 |
| 0.81875 | 0 |
| 0.8194444444444445 | 0 |
| 0.8201388888888889 | 0 |
| 0.8208333333333333 | 0 |
| 0.8215277777777777 | 0 |
| 0.8222222222222223 | 0 |
| 0.8229166666666666 | 0 |
| 0.8236111111111111 | 0 |
| 0.8243055555555556 | 0 |
| 0.8250000000000001 | 0 |
| 0.8256944444444444 | 0 |
| 0.8263888888888888 | 0 |
| 0.8270833333333334 | 0 |
| 0.8277777777777778 | 0 |
| 0.8284722222222222 | 0 |
| 0.8291666666666666 | 0 |
| 0.8298611111111112 | 0 |
| 0.8305555555555556 | 0 |
| 0.8312499999999999 | 0 |
| 0.8319444444444444 | 0 |
| 0.8326388888888889 | 0 |
| 0.8333333333333334 | 0 |
| 0.8340277777777777 | 0 |
| 0.8347222222222223 | 0 |
| 0.8354166666666667 | 0 |
| 0.8361111111111111 | 0 |
| 0.8368055555555555 | 0 |
| 0.8375 | 0 |
| 0.8381944444444445 | 0 |
| 0.8388888888888889 | 0 |
| 0.8395833333333332 | 0 |
| 0.8402777777777778 | 0 |
| 0.8409722222222222 | 0 |
| 0.8416666666666667 | 0 |
| 0.842361111111111 | 0 |
| 0.8430555555555556 | 0 |
| 0.84375 | 0 |
| 0.8444444444444444 | 0 |
| 0.845138888888889 | 0 |
| 0.8458333333333333 | 0 |
| 0.8465277777777778 | 0 |
| 0.8472222222222222 | 0 |
| 0.8479166666666668 | 0 |
| 0.8486111111111111 | 0 |
| 0.8493055555555555 | 0 |
| 0.85 | 0 |
| 0.8506944444444445 | 0 |
| 0.8513888888888889 | 0 |
| 0.8520833333333333 | 0 |
| 0.8527777777777777 | 0 |
| 0.8534722222222223 | 0 |
| 0.8541666666666666 | 0 |
| 0.8548611111111111 | 0 |
| 0.8555555555555556 | 0 |
| 0.8562500000000001 | 0 |
| 0.8569444444444444 | 0 |
| 0.8576388888888888 | 0 |
| 0.8583333333333334 | 0 |
| 0.8590277777777778 | 0 |
| 0.8597222222222222 | 0 |
| 0.8604166666666666 | 0 |
| 0.8611111111111112 | 0 |
| 0.8618055555555556 | 0 |
| 0.8624999999999999 | 0 |
| 0.8631944444444444 | 0 |
| 0.8638888888888889 | 0 |
| 0.8645833333333334 | 0 |
| 0.8652777777777777 | 0 |
| 0.8659722222222223 | 0 |
| 0.8666666666666667 | 0 |
| 0.8673611111111111 | 0 |
| 0.8680555555555555 | 0 |
| 0.86875 | 0 |
| 0.8694444444444445 | 0 |
| 0.8701388888888889 | 0 |
| 0.8708333333333332 | 0 |
| 0.8715277777777778 | 0 |
| 0.8722222222222222 | 0 |
| 0.8729166666666667 | 0 |
| 0.873611111111111 | 0 |
| 0.8743055555555556 | 0 |
| 0.875 | 0 |
| 0.8756944444444444 | 0 |
| 0.876388888888889 | 0 |
| 0.8770833333333333 | 0 |
| 0.8777777777777778 | 0 |
| 0.8784722222222222 | 0 |
| 0.8791666666666668 | 0 |
| 0.8798611111111111 | 0 |
| 0.8805555555555555 | 0 |
| 0.88125 | 0 |
| 0.8819444444444445 | 0 |
| 0.8826388888888889 | 0 |
| 0.8833333333333333 | 0 |
| 0.8840277777777777 | 0 |
| 0.8847222222222223 | 0 |
| 0.8854166666666666 | 0 |
| 0.8861111111111111 | 0 |
| 0.8868055555555556 | 0 |
| 0.8875000000000001 | 0 |
| 0.8881944444444444 | 0 |
| 0.8888888888888888 | 0 |
| 0.8895833333333334 | 0 |
| 0.8902777777777778 | 0 |
| 0.8909722222222222 | 0 |
| 0.8916666666666666 | 0 |
| 0.8923611111111112 | 0 |
| 0.8930555555555556 | 0 |
| 0.8937499999999999 | 0 |
| 0.8944444444444444 | 0 |
| 0.8951388888888889 | 0 |
| 0.8958333333333334 | 0 |
| 0.8965277777777777 | 0 |
| 0.8972222222222223 | 0 |
| 0.8979166666666667 | 0 |
| 0.8986111111111111 | 0 |
| 0.8993055555555555 | 0 |
| 0.9 | 0 |
| 0.9006944444444445 | 0 |
| 0.9013888888888889 | 0 |
| 0.9020833333333332 | 0 |
| 0.9027777777777778 | 0 |
| 0.9034722222222222 | 0 |
| 0.9041666666666667 | 0 |
| 0.904861111111111 | 0 |
| 0.9055555555555556 | 0 |
| 0.90625 | 0 |
| 0.9069444444444444 | 0 |
| 0.907638888888889 | 0 |
| 0.9083333333333333 | 0 |
| 0.9090277777777778 | 0 |
| 0.9097222222222222 | 0 |
| 0.9104166666666668 | 0 |
| 0.9111111111111111 | 0 |
| 0.9118055555555555 | 0 |
| 0.9125 | 0 |
| 0.9131944444444445 | 0 |
| 0.9138888888888889 | 0 |
| 0.9145833333333333 | 0 |
| 0.9152777777777777 | 0 |
| 0.9159722222222223 | 0 |
| 0.9166666666666666 | 0 |
| 0.9173611111111111 | 0 |
| 0.9180555555555556 | 0 |
| 0.9187500000000001 | 0 |
| 0.9194444444444444 | 0 |
| 0.9201388888888888 | 0 |
| 0.9208333333333334 | 0 |
| 0.9215277777777778 | 0 |
| 0.9222222222222222 | 0 |
| 0.9229166666666666 | 0 |
| 0.9236111111111112 | 0 |
| 0.9243055555555556 | 0 |
| 0.9249999999999999 | 0 |
| 0.9256944444444444 | 0 |
| 0.9263888888888889 | 0 |
| 0.9270833333333334 | 0 |
| 0.9277777777777777 | 0 |
| 0.9284722222222223 | 0 |
| 0.9291666666666667 | 0 |
| 0.9298611111111111 | 0 |
| 0.9305555555555555 | 0 |
| 0.93125 | 0 |
| 0.9319444444444445 | 0 |
| 0.9326388888888889 | 0 |
| 0.9333333333333332 | 0 |
| 0.9340277777777778 | 0 |
| 0.9347222222222222 | 0 |
| 0.9354166666666667 | 0 |
| 0.936111111111111 | 0 |
| 0.9368055555555556 | 0 |
| 0.9375 | 0 |
| 0.9381944444444444 | 0 |
| 0.938888888888889 | 0 |
| 0.9395833333333333 | 0 |
| 0.9402777777777778 | 0 |
| 0.9409722222222222 | 0 |
| 0.9416666666666668 | 0 |
| 0.9423611111111111 | 0 |
| 0.9430555555555555 | 0 |
| 0.94375 | 0 |
| 0.9444444444444445 | 0 |
| 0.9451388888888889 | 0 |
| 0.9458333333333333 | 0 |
| 0.9465277777777777 | 0 |
| 0.9472222222222223 | 0 |
| 0.9479166666666666 | 0 |
| 0.9486111111111111 | 0 |
| 0.9493055555555556 | 0 |
| 0.9500000000000001 | 0 |
| 0.9506944444444444 | 0 |
| 0.9513888888888888 | 0 |
| 0.9520833333333334 | 0 |
| 0.9527777777777778 | 0 |
| 0.9534722222222222 | 0 |
| 0.9541666666666666 | 0 |
| 0.9548611111111112 | 0 |
| 0.9555555555555556 | 0 |
| 0.9562499999999999 | 0 |
| 0.9569444444444444 | 0 |
| 0.9576388888888889 | 0 |
| 0.9583333333333334 | 0 |
| 0.9590277777777777 | 0 |
| 0.9597222222222223 | 0 |
| 0.9604166666666667 | 0 |
| 0.9611111111111111 | 0 |
| 0.9618055555555555 | 0 |
| 0.9625 | 0 |
| 0.9631944444444445 | 0 |
| 0.9638888888888889 | 0 |
| 0.9645833333333332 | 0 |
| 0.9652777777777778 | 0 |
| 0.9659722222222222 | 0 |
| 0.9666666666666667 | 0 |
| 0.967361111111111 | 0 |
| 0.9680555555555556 | 0 |
| 0.96875 | 0 |
| 0.9694444444444444 | 0 |
| 0.970138888888889 | 0 |
| 0.9708333333333333 | 0 |
| 0.9715277777777778 | 0 |
| 0.9722222222222222 | 0 |
| 0.9729166666666668 | 0 |
| 0.9736111111111111 | 0 |
| 0.9743055555555555 | 0 |
| 0.975 | 0 |
| 0.9756944444444445 | 0 |
| 0.9763888888888889 | 0 |
| 0.9770833333333333 | 0 |
| 0.9777777777777777 | 0 |
| 0.9784722222222223 | 0 |
| 0.9791666666666666 | 0 |
| 0.9798611111111111 | 0 |
| 0.9805555555555556 | 0 |
| 0.9812500000000001 | 0 |
| 0.9819444444444444 | 0 |
| 0.9826388888888888 | 0 |
| 0.9833333333333334 | 0 |
| 0.9840277777777778 | 0 |
| 0.9847222222222222 | 0 |
| 0.9854166666666666 | 0 |
| 0.9861111111111112 | 0 |
| 0.9868055555555556 | 0 |
| 0.9874999999999999 | 0 |
| 0.9881944444444444 | 0 |
| 0.9888888888888889 | 0 |
| 0.9895833333333334 | 0 |
| 0.9902777777777777 | 0 |
| 0.9909722222222223 | 0 |
| 0.9916666666666667 | 0 |
| 0.9923611111111111 | 0 |
| 0.9930555555555555 | 0 |
| 0.99375 | 0 |
| 0.9944444444444445 | 0 |
| 0.9951388888888889 | 0 |
| 0.9958333333333332 | 0 |
| 0.9965277777777778 | 0 |
| 0.9972222222222222 | 0 |
| 0.9979166666666667 | 0 |
| 0.998611111111111 | 0 |
| 0.9993055555555556 | 0 |